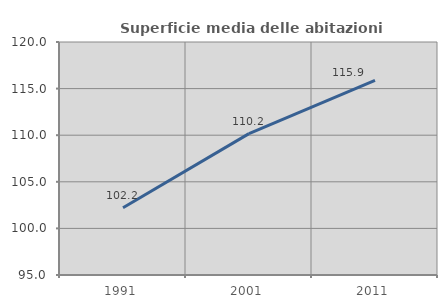
| Category | Superficie media delle abitazioni occupate |
|---|---|
| 1991.0 | 102.224 |
| 2001.0 | 110.17 |
| 2011.0 | 115.872 |